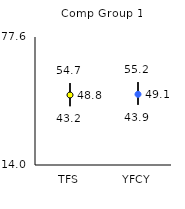
| Category | 25th | 75th | Mean |
|---|---|---|---|
| TFS | 43.2 | 54.7 | 48.78 |
| YFCY | 43.9 | 55.2 | 49.13 |